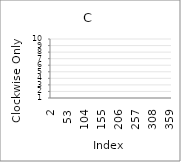
| Category | Series 0 |
|---|---|
| 2.0 | 5 |
| 3.0 | 5 |
| 4.0 | 7 |
| 5.0 | 1 |
| 6.0 | 7 |
| 7.0 | 7 |
| 8.0 | 1 |
| 9.0 | 7 |
| 10.0 | 4 |
| 11.0 | 2 |
| 12.0 | 8 |
| 13.0 | 9 |
| 14.0 | 5 |
| 15.0 | 7 |
| 16.0 | 9 |
| 17.0 | 10 |
| 18.0 | 1 |
| 19.0 | 3 |
| 20.0 | 1 |
| 21.0 | 7 |
| 22.0 | 7 |
| 23.0 | 1 |
| 24.0 | 7 |
| 25.0 | 2 |
| 26.0 | 7 |
| 27.0 | 5 |
| 28.0 | 3 |
| 29.0 | 9 |
| 30.0 | 4 |
| 31.0 | 1 |
| 32.0 | 5 |
| 33.0 | 9 |
| 34.0 | 10 |
| 35.0 | 8 |
| 36.0 | 3 |
| 37.0 | 2 |
| 38.0 | 10 |
| 39.0 | 4 |
| 40.0 | 2 |
| 41.0 | 4 |
| 42.0 | 6 |
| 43.0 | 4 |
| 44.0 | 7 |
| 45.0 | 8 |
| 46.0 | 10 |
| 47.0 | 6 |
| 48.0 | 10 |
| 49.0 | 7 |
| 50.0 | 7 |
| 51.0 | 6 |
| 52.0 | 1 |
| 53.0 | 6 |
| 54.0 | 5 |
| 55.0 | 7 |
| 56.0 | 5 |
| 57.0 | 9 |
| 58.0 | 8 |
| 59.0 | 3 |
| 60.0 | 3 |
| 61.0 | 3 |
| 62.0 | 2 |
| 63.0 | 10 |
| 64.0 | 1 |
| 65.0 | 10 |
| 66.0 | 3 |
| 67.0 | 8 |
| 68.0 | 9 |
| 69.0 | 10 |
| 70.0 | 2 |
| 71.0 | 7 |
| 72.0 | 1 |
| 73.0 | 6 |
| 74.0 | 4 |
| 75.0 | 8 |
| 76.0 | 2 |
| 77.0 | 1 |
| 78.0 | 2 |
| 79.0 | 7 |
| 80.0 | 3 |
| 81.0 | 8 |
| 82.0 | 6 |
| 83.0 | 9 |
| 84.0 | 8 |
| 85.0 | 9 |
| 86.0 | 7 |
| 87.0 | 7 |
| 88.0 | 10 |
| 89.0 | 9 |
| 90.0 | 7 |
| 91.0 | 7 |
| 92.0 | 3 |
| 93.0 | 10 |
| 94.0 | 2 |
| 95.0 | 8 |
| 96.0 | 1 |
| 97.0 | 7 |
| 98.0 | 4 |
| 99.0 | 10 |
| 100.0 | 2 |
| 101.0 | 3 |
| 102.0 | 8 |
| 103.0 | 1 |
| 104.0 | 5 |
| 105.0 | 10 |
| 106.0 | 3 |
| 107.0 | 3 |
| 108.0 | 2 |
| 109.0 | 10 |
| 110.0 | 9 |
| 111.0 | 2 |
| 112.0 | 4 |
| 113.0 | 3 |
| 114.0 | 2 |
| 115.0 | 8 |
| 116.0 | 4 |
| 117.0 | 6 |
| 118.0 | 3 |
| 119.0 | 2 |
| 120.0 | 8 |
| 121.0 | 2 |
| 122.0 | 1 |
| 123.0 | 4 |
| 124.0 | 6 |
| 125.0 | 9 |
| 126.0 | 5 |
| 127.0 | 9 |
| 128.0 | 3 |
| 129.0 | 5 |
| 130.0 | 6 |
| 131.0 | 6 |
| 132.0 | 7 |
| 133.0 | 4 |
| 134.0 | 8 |
| 135.0 | 2 |
| 136.0 | 8 |
| 137.0 | 1 |
| 138.0 | 6 |
| 139.0 | 2 |
| 140.0 | 1 |
| 141.0 | 9 |
| 142.0 | 2 |
| 143.0 | 2 |
| 144.0 | 7 |
| 145.0 | 6 |
| 146.0 | 2 |
| 147.0 | 10 |
| 148.0 | 2 |
| 149.0 | 6 |
| 150.0 | 7 |
| 151.0 | 7 |
| 152.0 | 7 |
| 153.0 | 3 |
| 154.0 | 3 |
| 155.0 | 5 |
| 156.0 | 5 |
| 157.0 | 5 |
| 158.0 | 2 |
| 159.0 | 10 |
| 160.0 | 6 |
| 161.0 | 8 |
| 162.0 | 5 |
| 163.0 | 9 |
| 164.0 | 9 |
| 165.0 | 2 |
| 166.0 | 10 |
| 167.0 | 10 |
| 168.0 | 1 |
| 169.0 | 5 |
| 170.0 | 10 |
| 171.0 | 7 |
| 172.0 | 3 |
| 173.0 | 2 |
| 174.0 | 4 |
| 175.0 | 8 |
| 176.0 | 8 |
| 177.0 | 1 |
| 178.0 | 3 |
| 179.0 | 7 |
| 180.0 | 5 |
| 181.0 | 1 |
| 182.0 | 6 |
| 183.0 | 3 |
| 184.0 | 7 |
| 185.0 | 7 |
| 186.0 | 6 |
| 187.0 | 2 |
| 188.0 | 1 |
| 189.0 | 7 |
| 190.0 | 7 |
| 191.0 | 1 |
| 192.0 | 7 |
| 193.0 | 2 |
| 194.0 | 9 |
| 195.0 | 6 |
| 196.0 | 9 |
| 197.0 | 1 |
| 198.0 | 6 |
| 199.0 | 3 |
| 200.0 | 3 |
| 201.0 | 1 |
| 202.0 | 2 |
| 203.0 | 9 |
| 204.0 | 3 |
| 205.0 | 1 |
| 206.0 | 1 |
| 207.0 | 1 |
| 208.0 | 1 |
| 209.0 | 9 |
| 210.0 | 8 |
| 211.0 | 3 |
| 212.0 | 3 |
| 213.0 | 4 |
| 214.0 | 3 |
| 215.0 | 7 |
| 216.0 | 2 |
| 217.0 | 7 |
| 218.0 | 10 |
| 219.0 | 3 |
| 220.0 | 10 |
| 221.0 | 4 |
| 222.0 | 3 |
| 223.0 | 2 |
| 224.0 | 3 |
| 225.0 | 3 |
| 226.0 | 9 |
| 227.0 | 6 |
| 228.0 | 4 |
| 229.0 | 8 |
| 230.0 | 7 |
| 231.0 | 4 |
| 232.0 | 8 |
| 233.0 | 4 |
| 234.0 | 5 |
| 235.0 | 9 |
| 236.0 | 3 |
| 237.0 | 5 |
| 238.0 | 3 |
| 239.0 | 10 |
| 240.0 | 5 |
| 241.0 | 6 |
| 242.0 | 1 |
| 243.0 | 7 |
| 244.0 | 6 |
| 245.0 | 3 |
| 246.0 | 1 |
| 247.0 | 10 |
| 248.0 | 6 |
| 249.0 | 9 |
| 250.0 | 6 |
| 251.0 | 8 |
| 252.0 | 4 |
| 253.0 | 4 |
| 254.0 | 1 |
| 255.0 | 3 |
| 256.0 | 5 |
| 257.0 | 7 |
| 258.0 | 6 |
| 259.0 | 1 |
| 260.0 | 10 |
| 261.0 | 10 |
| 262.0 | 9 |
| 263.0 | 4 |
| 264.0 | 10 |
| 265.0 | 4 |
| 266.0 | 10 |
| 267.0 | 8 |
| 268.0 | 9 |
| 269.0 | 5 |
| 270.0 | 3 |
| 271.0 | 2 |
| 272.0 | 10 |
| 273.0 | 8 |
| 274.0 | 5 |
| 275.0 | 7 |
| 276.0 | 9 |
| 277.0 | 10 |
| 278.0 | 9 |
| 279.0 | 2 |
| 280.0 | 4 |
| 281.0 | 7 |
| 282.0 | 1 |
| 283.0 | 3 |
| 284.0 | 3 |
| 285.0 | 8 |
| 286.0 | 4 |
| 287.0 | 1 |
| 288.0 | 8 |
| 289.0 | 5 |
| 290.0 | 10 |
| 291.0 | 8 |
| 292.0 | 5 |
| 293.0 | 10 |
| 294.0 | 3 |
| 295.0 | 8 |
| 296.0 | 10 |
| 297.0 | 2 |
| 298.0 | 9 |
| 299.0 | 3 |
| 300.0 | 10 |
| 301.0 | 8 |
| 302.0 | 1 |
| 303.0 | 2 |
| 304.0 | 3 |
| 305.0 | 5 |
| 306.0 | 8 |
| 307.0 | 6 |
| 308.0 | 6 |
| 309.0 | 9 |
| 310.0 | 1 |
| 311.0 | 8 |
| 312.0 | 4 |
| 313.0 | 2 |
| 314.0 | 3 |
| 315.0 | 5 |
| 316.0 | 7 |
| 317.0 | 10 |
| 318.0 | 1 |
| 319.0 | 4 |
| 320.0 | 8 |
| 321.0 | 7 |
| 322.0 | 4 |
| 323.0 | 1 |
| 324.0 | 6 |
| 325.0 | 4 |
| 326.0 | 3 |
| 327.0 | 5 |
| 328.0 | 8 |
| 329.0 | 8 |
| 330.0 | 7 |
| 331.0 | 8 |
| 332.0 | 3 |
| 333.0 | 2 |
| 334.0 | 9 |
| 335.0 | 8 |
| 336.0 | 9 |
| 337.0 | 1 |
| 338.0 | 5 |
| 339.0 | 4 |
| 340.0 | 5 |
| 341.0 | 10 |
| 342.0 | 4 |
| 343.0 | 5 |
| 344.0 | 10 |
| 345.0 | 4 |
| 346.0 | 8 |
| 347.0 | 8 |
| 348.0 | 3 |
| 349.0 | 10 |
| 350.0 | 5 |
| 351.0 | 2 |
| 352.0 | 10 |
| 353.0 | 10 |
| 354.0 | 4 |
| 355.0 | 10 |
| 356.0 | 7 |
| 357.0 | 9 |
| 358.0 | 4 |
| 359.0 | 5 |
| 360.0 | 3 |
| 361.0 | 2 |
| 362.0 | 9 |
| 363.0 | 2 |
| 364.0 | 8 |
| 365.0 | 8 |